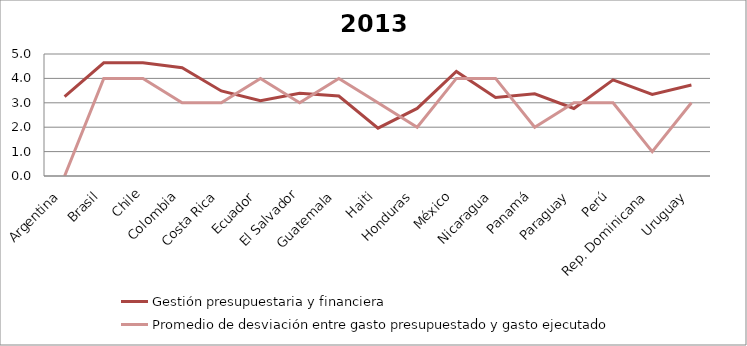
| Category | Gestión presupuestaria y financiera | Promedio de desviación entre gasto presupuestado y gasto ejecutado |
|---|---|---|
| Argentina | 3.253 | 0 |
| Brasil | 4.64 | 4 |
| Chile | 4.64 | 4 |
| Colombia | 4.44 | 3 |
| Costa Rica | 3.485 | 3 |
| Ecuador | 3.087 | 4 |
| El Salvador | 3.392 | 3 |
| Guatemala | 3.275 | 4 |
| Haiti | 1.961 | 3 |
| Honduras | 2.771 | 2 |
| México | 4.287 | 4 |
| Nicaragua | 3.22 | 4 |
| Panamá | 3.367 | 2 |
| Paraguay | 2.767 | 3 |
| Perú | 3.94 | 3 |
| Rep. Dominicana | 3.347 | 1 |
| Uruguay | 3.727 | 3 |